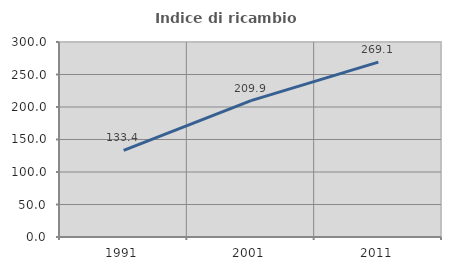
| Category | Indice di ricambio occupazionale  |
|---|---|
| 1991.0 | 133.415 |
| 2001.0 | 209.893 |
| 2011.0 | 269.113 |